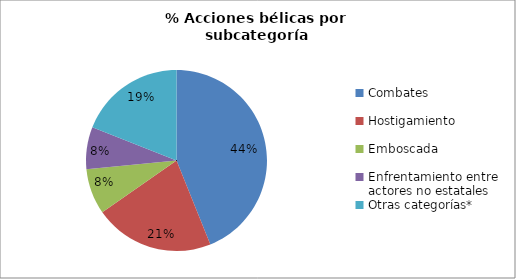
| Category | Series 0 |
|---|---|
| Combates | 0.439 |
| Hostigamiento | 0.214 |
| Emboscada | 0.082 |
| Enfrentamiento entre actores no estatales | 0.075 |
| Otras categorías* | 0.19 |